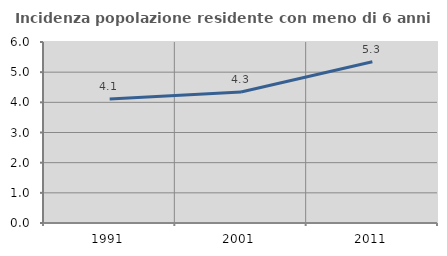
| Category | Incidenza popolazione residente con meno di 6 anni |
|---|---|
| 1991.0 | 4.113 |
| 2001.0 | 4.343 |
| 2011.0 | 5.347 |